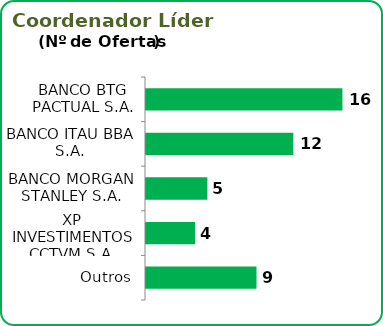
| Category | Líder |
|---|---|
| BANCO BTG PACTUAL S.A. | 16 |
| BANCO ITAU BBA S.A. | 12 |
| BANCO MORGAN STANLEY S.A. | 5 |
| XP INVESTIMENTOS CCTVM S.A. | 4 |
| Outros | 9 |